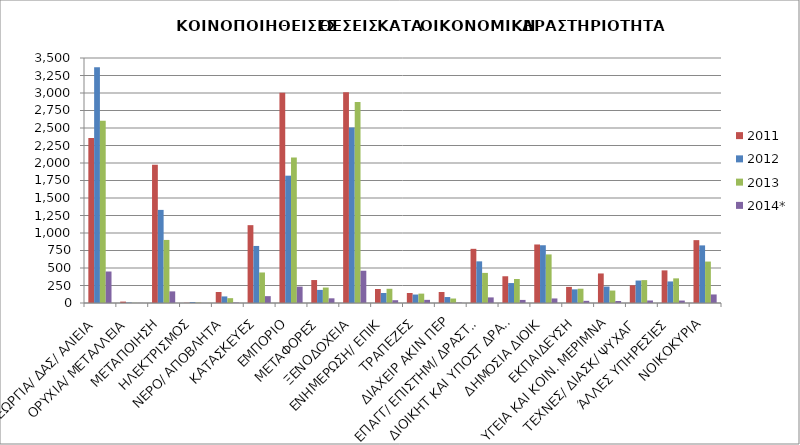
| Category | 2011 | 2012 | 2013 | 2014* |
|---|---|---|---|---|
| ΓΕΩΡΓΙΑ/ ΔΑΣ/ ΑΛΙΕΙΑ | 2358 | 3368 | 2605 | 450 |
| ΟΡΥΧΙΑ/ ΜΕΤΑΛΛΕΙΑ | 20 | 7 | 2 | 1 |
| ΜΕΤΑΠΟΙΗΣΗ | 1976 | 1330 | 901 | 166 |
| ΗΛΕΚΤΡΙΣΜΟΣ | 3 | 13 | 5 | 0 |
| ΝΕΡΟ/ ΑΠΟΒΛΗΤΑ | 157 | 94 | 69 | 6 |
| ΚΑΤΑΣΚΕΥΕΣ | 1112 | 815 | 436 | 98 |
| ΕΜΠΟΡΙΟ | 3005 | 1819 | 2077 | 234 |
| ΜΕΤΑΦΟΡΕΣ | 328 | 187 | 221 | 67 |
| ΞΕΝΟΔΟΧΕΙΑ | 3010 | 2507 | 2873 | 461 |
| ΕΝΗΜΕΡΩΣΗ/ ΕΠΙΚ | 200 | 143 | 203 | 40 |
| ΤΡΑΠΕΖΕΣ | 143 | 121 | 134 | 45 |
| ΔΙΑΧΕΙΡ ΑΚΙΝ ΠΕΡ | 157 | 85 | 64 | 6 |
| ΕΠΑΓΓ/ ΕΠΙΣΤΗΜ/ ΔΡΑΣΤΗΡ | 774 | 595 | 430 | 80 |
| ΔΙΟΙΚΗΤ ΚΑΙ ΥΠΟΣΤ ΔΡΑΣΤΗΡ  | 382 | 285 | 343 | 44 |
| ΔΗΜΟΣΙΑ ΔΙΟΙΚ | 836 | 825 | 694 | 65 |
| ΕΚΠΑΙΔΕΥΣΗ | 230 | 195 | 204 | 31 |
| ΥΓΕΙΑ ΚΑΙ ΚΟΙΝ. ΜΕΡΙΜΝΑ | 422 | 235 | 178 | 29 |
| ΤΕΧΝΕΣ/ ΔΙΑΣΚ/ ΨΥΧΑΓ | 253 | 321 | 327 | 36 |
| ΆΛΛΕΣ ΥΠΗΡΕΣΙΕΣ | 466 | 308 | 352 | 35 |
| ΝΟΙΚΟΚΥΡΙΑ | 898 | 823 | 592 | 122 |